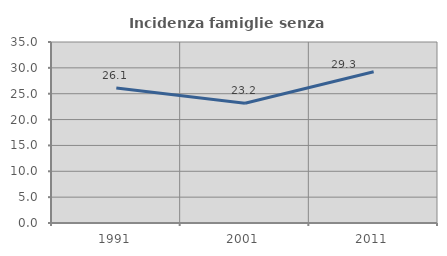
| Category | Incidenza famiglie senza nuclei |
|---|---|
| 1991.0 | 26.102 |
| 2001.0 | 23.151 |
| 2011.0 | 29.255 |